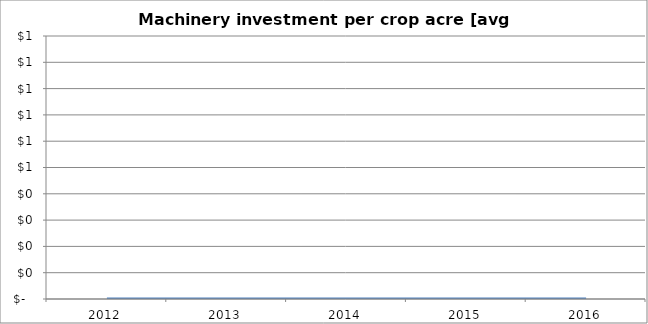
| Category | Machinery investment per crop acre [average G/P] |
|---|---|
| 2012.0 | 0 |
| 2013.0 | 0 |
| 2014.0 | 0 |
| 2015.0 | 0 |
| 2016.0 | 0 |